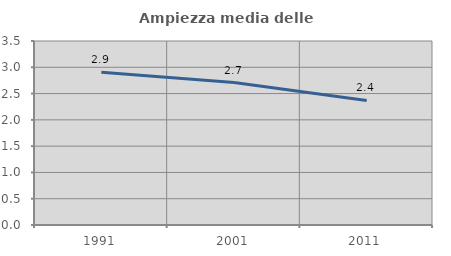
| Category | Ampiezza media delle famiglie |
|---|---|
| 1991.0 | 2.904 |
| 2001.0 | 2.709 |
| 2011.0 | 2.368 |